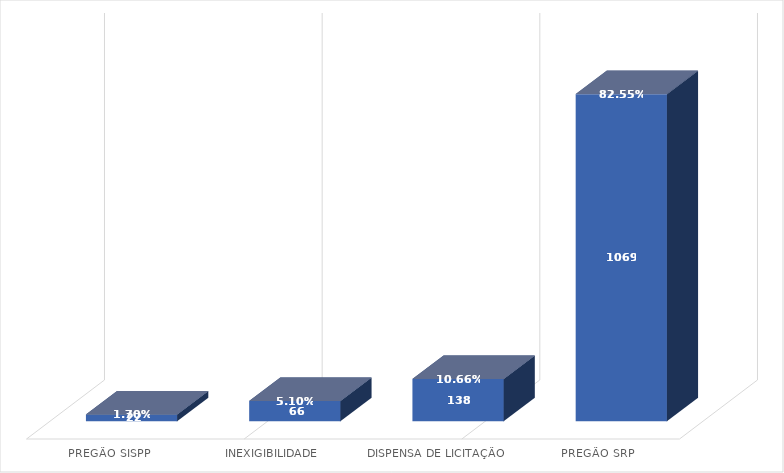
| Category | Soma de Quantidade de itens | Soma de Quantidade de itens2 |
|---|---|---|
| PREGÃO SISPP | 22 | 0.017 |
| INEXIGIBILIDADE | 66 | 0.051 |
| DISPENSA DE LICITAÇÃO | 138 | 0.107 |
| PREGÃO SRP | 1069 | 0.825 |